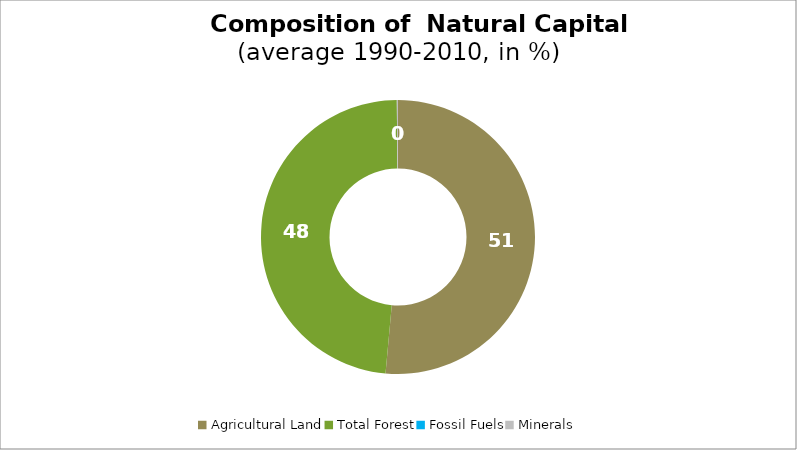
| Category | Series 0 |
|---|---|
| Agricultural Land | 51.452 |
| Total Forest | 48.408 |
| Fossil Fuels | 0 |
| Minerals | 0.14 |